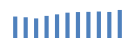
| Category | Exportações (1) |
|---|---|
| 0 | 595986.616 |
| 1 | 575965.577 |
| 2 | 544011.291 |
| 3 | 614380.205 |
| 4 | 656918.26 |
| 5 | 703504.835 |
| 6 | 720793.562 |
| 7 | 726284.803 |
| 8 | 735533.905 |
| 9 | 723670.503 |
| 10 | 779036.331 |